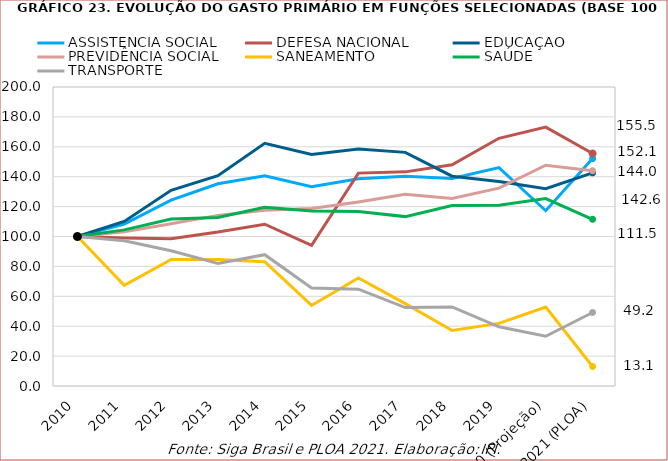
| Category | ASSISTÊNCIA SOCIAL | DEFESA NACIONAL | EDUCAÇÃO | PREVIDÊNCIA SOCIAL | SANEAMENTO | SAÚDE | TRANSPORTE |
|---|---|---|---|---|---|---|---|
| 2010 | 100 | 100 | 100 | 100 | 100 | 100 | 100 |
| 2011 | 108.376 | 99.066 | 110.04 | 103.222 | 67.317 | 104.417 | 97.188 |
| 2012 | 124.293 | 98.577 | 130.926 | 108.492 | 84.582 | 111.634 | 90.43 |
| 2013 | 135.23 | 102.985 | 140.672 | 114.118 | 84.634 | 112.702 | 81.954 |
| 2014 | 140.65 | 108.217 | 162.375 | 117.479 | 83.191 | 119.542 | 87.838 |
| 2015 | 133.229 | 94.03 | 154.802 | 118.667 | 53.897 | 117.124 | 65.5 |
| 2016 | 138.564 | 142.4 | 158.475 | 123.148 | 72.296 | 116.687 | 64.794 |
| 2017 | 140.319 | 143.234 | 156.286 | 128.273 | 55.059 | 113.307 | 52.43 |
| 2018 | 138.749 | 148.02 | 140.357 | 125.39 | 37.083 | 120.759 | 52.87 |
| 2019 | 146.061 | 165.676 | 136.763 | 132.367 | 41.887 | 120.941 | 39.603 |
| 2020 (Projeção) | 117.237 | 173.188 | 132.002 | 147.689 | 52.802 | 125.34 | 33.256 |
| 2021 (PLOA) | 152.115 | 155.528 | 142.591 | 143.987 | 13.058 | 111.499 | 49.177 |